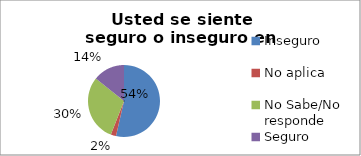
| Category | Series 0 |
|---|---|
| Inseguro | 0.536 |
| No aplica  | 0.024 |
| No Sabe/No responde | 0.298 |
| Seguro | 0.143 |